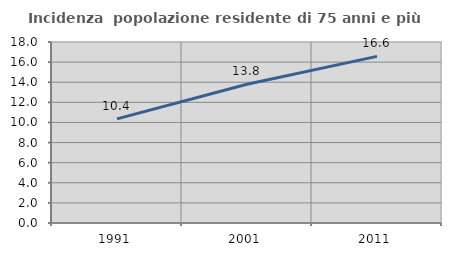
| Category | Incidenza  popolazione residente di 75 anni e più |
|---|---|
| 1991.0 | 10.354 |
| 2001.0 | 13.793 |
| 2011.0 | 16.573 |